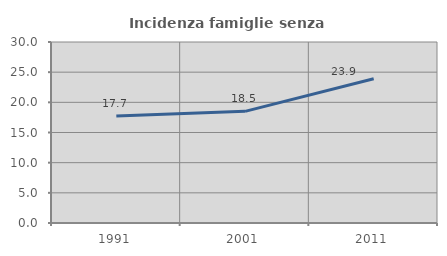
| Category | Incidenza famiglie senza nuclei |
|---|---|
| 1991.0 | 17.716 |
| 2001.0 | 18.505 |
| 2011.0 | 23.919 |